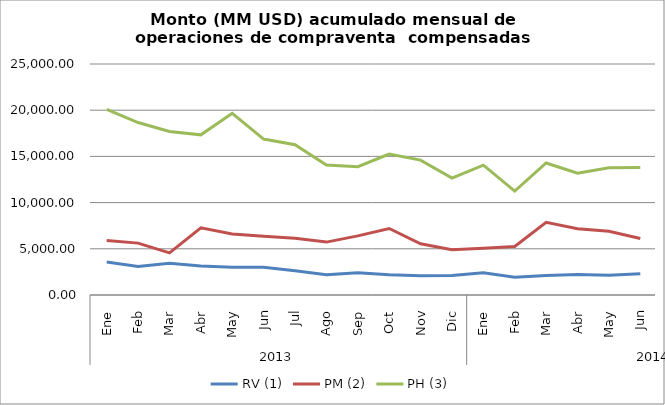
| Category | RV (1) | PM (2) | PH (3) |
|---|---|---|---|
| 0 | 3582.113 | 5901.651 | 20087.034 |
| 1 | 3086.223 | 5614.086 | 18662.914 |
| 2 | 3427.503 | 4559.027 | 17696.541 |
| 3 | 3146.302 | 7279.906 | 17332.385 |
| 4 | 2992.826 | 6596.857 | 19663.42 |
| 5 | 3012.804 | 6346.526 | 16878.408 |
| 6 | 2618.878 | 6139.885 | 16263.385 |
| 7 | 2182.732 | 5724.829 | 14069.305 |
| 8 | 2409.674 | 6399.577 | 13889.23 |
| 9 | 2180.079 | 7195.606 | 15254.774 |
| 10 | 2095.442 | 5541.836 | 14598.61 |
| 11 | 2104.88 | 4905.995 | 12657.524 |
| 12 | 2410.581 | 5047.1 | 14052.921 |
| 13 | 1913.3 | 5251.955 | 11240.27 |
| 14 | 2111.981 | 7861.413 | 14290.324 |
| 15 | 2223.473 | 7175.644 | 13176.799 |
| 16 | 2125.013 | 6892.343 | 13776.518 |
| 17 | 2301.328 | 6106.398 | 13805.87 |